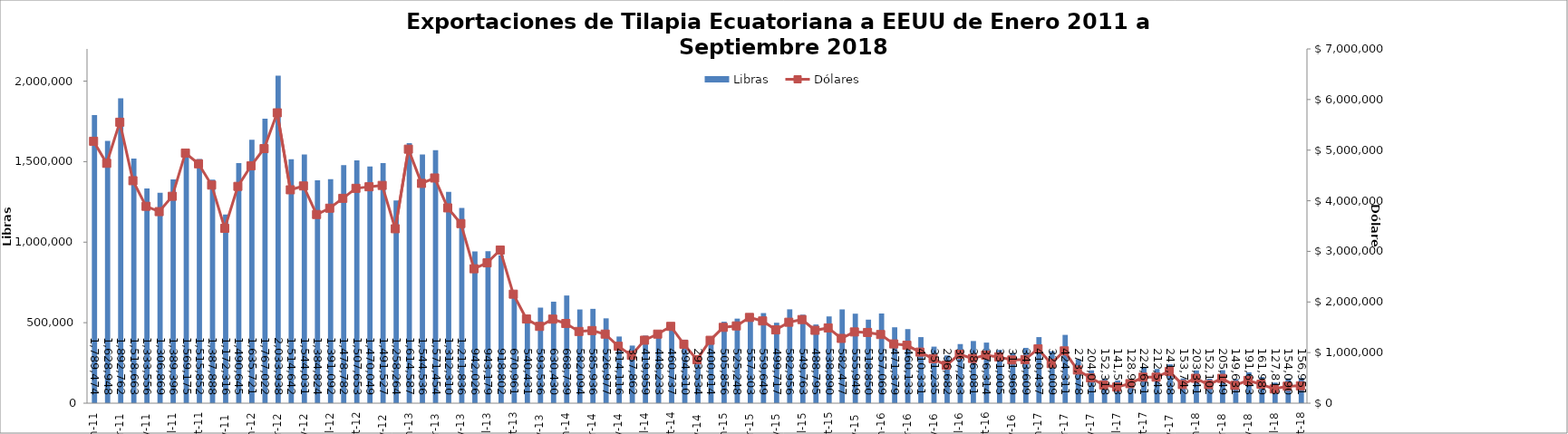
| Category | Libras  |
|---|---|
| 2011-01-01 | 1789473.82 |
| 2011-02-01 | 1628948.076 |
| 2011-03-01 | 1892761.535 |
| 2011-04-01 | 1518662.961 |
| 2011-05-01 | 1333555.926 |
| 2011-06-01 | 1306869.243 |
| 2011-07-01 | 1389396.24 |
| 2011-08-01 | 1569174.756 |
| 2011-09-01 | 1515852.096 |
| 2011-10-01 | 1387888.293 |
| 2011-11-01 | 1172315.891 |
| 2011-12-01 | 1490644.699 |
| 2012-01-01 | 1635720.607 |
| 2012-02-01 | 1767022.174 |
| 2012-03-01 | 2033937.505 |
| 2012-04-01 | 1514641.77 |
| 2012-05-01 | 1544031.293 |
| 2012-06-01 | 1384823.899 |
| 2012-07-01 | 1391091.577 |
| 2012-08-01 | 1478781.747 |
| 2012-09-01 | 1507653.188 |
| 2012-10-01 | 1470049.326 |
| 2012-11-01 | 1491526.539 |
| 2012-12-01 | 1258264 |
| 2013-01-01 | 1614587 |
| 2013-02-01 | 1544536.146 |
| 2013-03-01 | 1571454.312 |
| 2013-04-01 | 1312310.196 |
| 2013-05-01 | 1211835.551 |
| 2013-06-01 | 942025.58 |
| 2013-07-01 | 943178.586 |
| 2013-08-01 | 918802.324 |
| 2013-09-01 | 670961.192 |
| 2013-10-01 | 540431.235 |
| 2013-11-01 | 593535.64 |
| 2013-12-01 | 630429.621 |
| 2014-01-01 | 668739 |
| 2014-02-01 | 582093.766 |
| 2014-03-01 | 585936.383 |
| 2014-04-01 | 526976.561 |
| 2014-05-01 | 414116.473 |
| 2014-06-01 | 357861.695 |
| 2014-07-01 | 419958.663 |
| 2014-08-01 | 448233 |
| 2014-09-01 | 460737.149 |
| 2014-10-01 | 394310.347 |
| 2014-11-01 | 293533.672 |
| 2014-12-01 | 400013.647 |
| 2015-01-01 | 505856.493 |
| 2015-02-01 | 525248 |
| 2015-03-01 | 557303.039 |
| 2015-04-01 | 559648.733 |
| 2015-05-01 | 499716.682 |
| 2015-06-01 | 582955.764 |
| 2015-07-01 | 549763.307 |
| 2015-08-01 | 488795.094 |
| 2015-09-01 | 538890.219 |
| 2015-10-01 | 582477.366 |
| 2015-11-01 | 555949.414 |
| 2015-12-01 | 518850.405 |
| 2016-01-01 | 557069.351 |
| 2016-02-01 | 471378.754 |
| 2016-03-01 | 460133.089 |
| 2016-04-01 | 410331.175 |
| 2016-05-01 | 351235 |
| 2016-06-01 | 296682 |
| 2016-07-01 | 367233.45 |
| 2016-08-01 | 386080.575 |
| 2016-09-01 | 376314.197 |
| 2016-10-01 | 331005.258 |
| 2016-11-01 | 311968.537 |
| 2016-12-01 | 343608.956 |
| 2017-01-01 | 410436.996 |
| 2017-02-01 | 323009.174 |
| 2017-03-01 | 424310.544 |
| 2017-04-01 | 273577.632 |
| 2017-05-01 | 204031.321 |
| 2017-06-01 | 152318.019 |
| 2017-07-01 | 141513.274 |
| 2017-08-01 | 128905.167 |
| 2017-09-01 | 224650.945 |
| 2017-10-01 | 212543.281 |
| 2017-11-01 | 241337.562 |
| 2017-12-01 | 153742.19 |
| 2018-01-01 | 203341.281 |
| 2018-02-01 | 152101.968 |
| 2018-03-01 | 205149.053 |
| 2018-04-01 | 149630.611 |
| 2018-05-01 | 191643 |
| 2018-06-01 | 161989 |
| 2018-07-01 | 127813 |
| 2018-08-01 | 154089.894 |
| 2018-09-01 | 156951.494 |